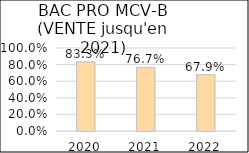
| Category | BAC PRO MCV-B 
(VENTE jusqu'à 2021) |
|---|---|
| 2020.0 | 0.833 |
| 2021.0 | 0.767 |
| 2022.0 | 0.679 |